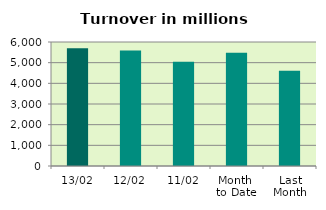
| Category | Series 0 |
|---|---|
| 13/02 | 5696.435 |
| 12/02 | 5586.568 |
| 11/02 | 5049.998 |
| Month 
to Date | 5482.937 |
| Last
Month | 4609.616 |